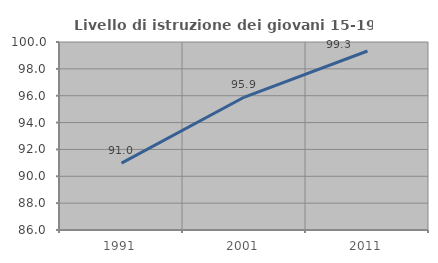
| Category | Livello di istruzione dei giovani 15-19 anni |
|---|---|
| 1991.0 | 90.984 |
| 2001.0 | 95.902 |
| 2011.0 | 99.329 |